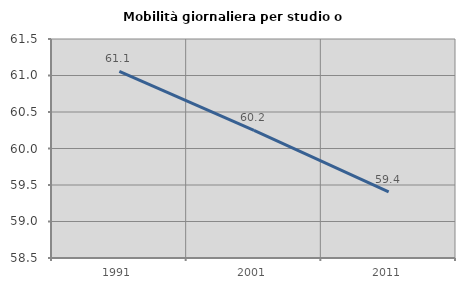
| Category | Mobilità giornaliera per studio o lavoro |
|---|---|
| 1991.0 | 61.058 |
| 2001.0 | 60.249 |
| 2011.0 | 59.405 |